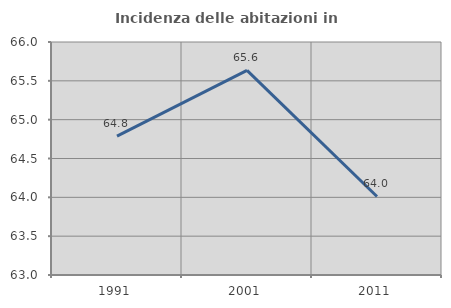
| Category | Incidenza delle abitazioni in proprietà  |
|---|---|
| 1991.0 | 64.789 |
| 2001.0 | 65.634 |
| 2011.0 | 64.011 |